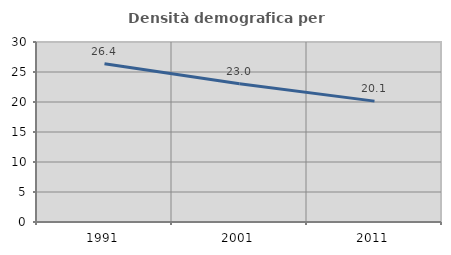
| Category | Densità demografica |
|---|---|
| 1991.0 | 26.362 |
| 2001.0 | 23.044 |
| 2011.0 | 20.147 |